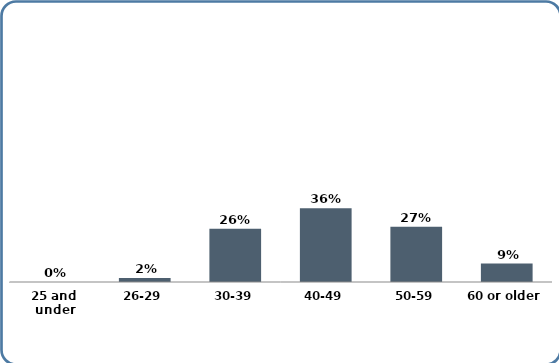
| Category | Series 0 |
|---|---|
| 25 and under | 0 |
| 26-29 | 0.02 |
| 30-39 | 0.26 |
| 40-49 | 0.36 |
| 50-59 | 0.27 |
| 60 or older | 0.09 |